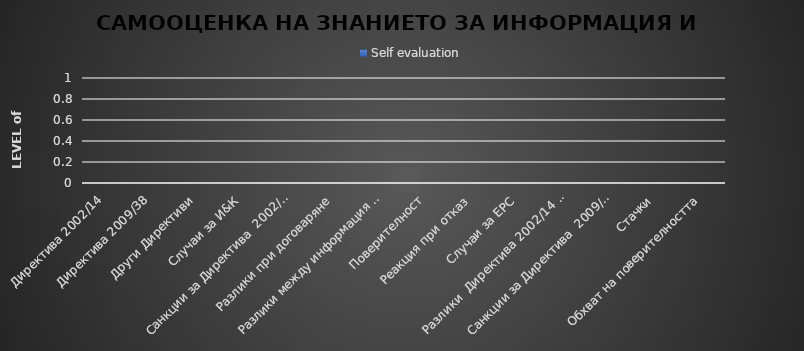
| Category | Self evaluation |
|---|---|
| Директива 2002/14 | 0 |
| Директива 2009/38 | 0 |
| Други Директиви | 0 |
| Случаи за И&К | 0 |
| Санкции за Директива  2002/14 | 0 |
| Разлики при договаряне | 0 |
| Разлики между информация и консултация | 0 |
| Поверителност | 0 |
| Реакция при отказ | 0 |
| Случаи за ЕРС | 0 |
| Разлики  Директива 2002/14 и Директива 2009 / 38 | 0 |
| Санкции за Директива  2009/38 | 0 |
| Стачки | 0 |
| Обхват на поверителността | 0 |